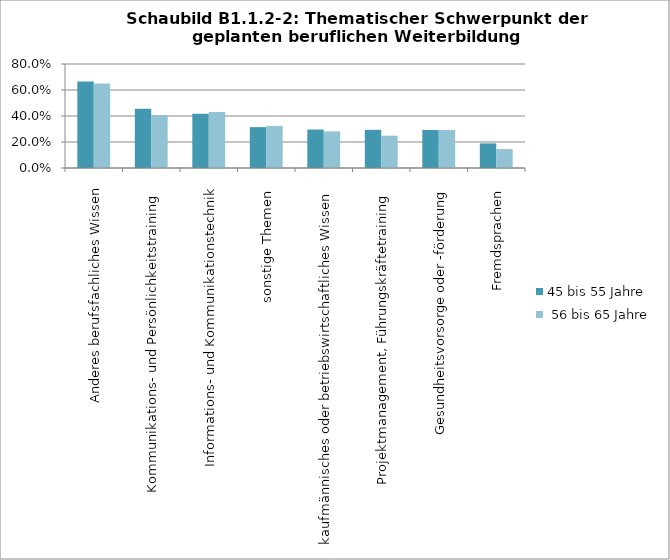
| Category | 45 bis 55 Jahre |  56 bis 65 Jahre |
|---|---|---|
| Anderes berufsfachliches Wissen | 0.666 | 0.651 |
| Kommunikations- und Persönlichkeitstraining   | 0.456 | 0.407 |
| Informations- und Kommunikationstechnik | 0.416 | 0.431 |
| sonstige Themen  | 0.314 | 0.324 |
|  kaufmännisches oder betriebswirtschaftliches Wissen  | 0.296 | 0.281 |
| Projektmanagement, Führungskräftetraining  | 0.294 | 0.249 |
| Gesundheitsvorsorge oder -förderung | 0.292 | 0.292 |
| Fremdsprachen  | 0.189 | 0.145 |